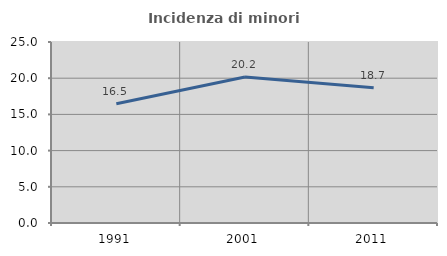
| Category | Incidenza di minori stranieri |
|---|---|
| 1991.0 | 16.484 |
| 2001.0 | 20.158 |
| 2011.0 | 18.681 |